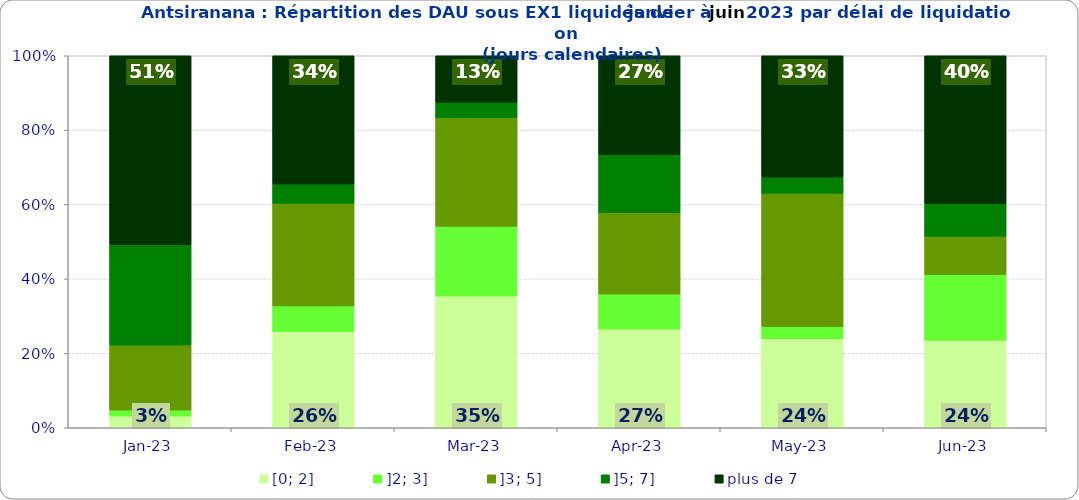
| Category | [0; 2] | ]2; 3] | ]3; 5] | ]5; 7] | plus de 7 |
|---|---|---|---|---|---|
| 2023-01-01 | 0.032 | 0.016 | 0.175 | 0.27 | 0.508 |
| 2023-02-01 | 0.259 | 0.069 | 0.276 | 0.052 | 0.345 |
| 2023-03-01 | 0.354 | 0.188 | 0.292 | 0.042 | 0.125 |
| 2023-04-01 | 0.266 | 0.094 | 0.219 | 0.156 | 0.266 |
| 2023-05-01 | 0.239 | 0.033 | 0.359 | 0.043 | 0.326 |
| 2023-06-01 | 0.235 | 0.176 | 0.103 | 0.088 | 0.397 |